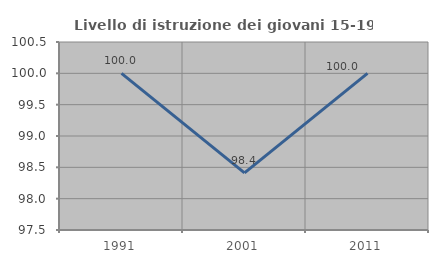
| Category | Livello di istruzione dei giovani 15-19 anni |
|---|---|
| 1991.0 | 100 |
| 2001.0 | 98.413 |
| 2011.0 | 100 |